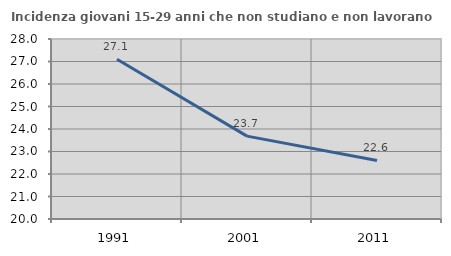
| Category | Incidenza giovani 15-29 anni che non studiano e non lavorano  |
|---|---|
| 1991.0 | 27.103 |
| 2001.0 | 23.684 |
| 2011.0 | 22.603 |